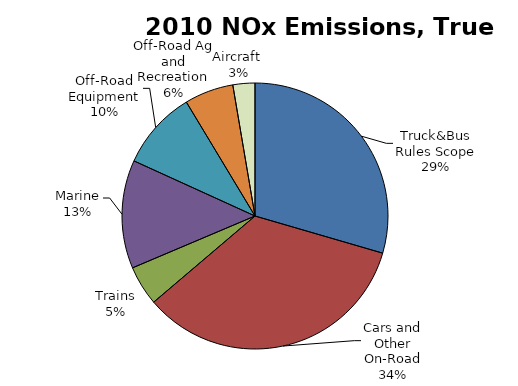
| Category | Series 0 |
|---|---|
| Truck&Bus Rules Scope | 582.54 |
| Cars and Other On-Road | 676.709 |
| Trains | 95.588 |
| Marine | 260.062 |
| Off-Road Equipment | 188.953 |
| Off-Road Ag and Recreation | 117.625 |
| Aircraft  | 52.805 |